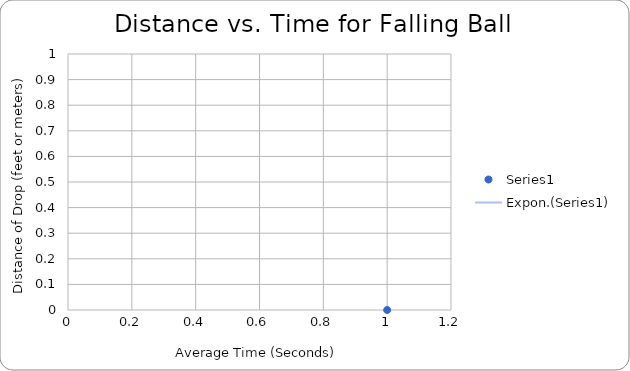
| Category | Series 0 |
|---|---|
| 0 | 0 |
| 1 | 1 |
| 2 | 2 |
| 3 | 3 |
| 4 | 4 |
| 5 | 5 |
| 6 | 6 |
| 7 | 7 |
| 8 | 8 |
| 9 | 9 |
| 10 | 10 |